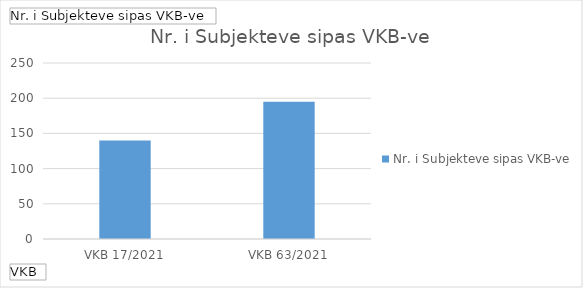
| Category | Totali |
|---|---|
| VKB 17/2021 | 140 |
| VKB 63/2021 | 195 |